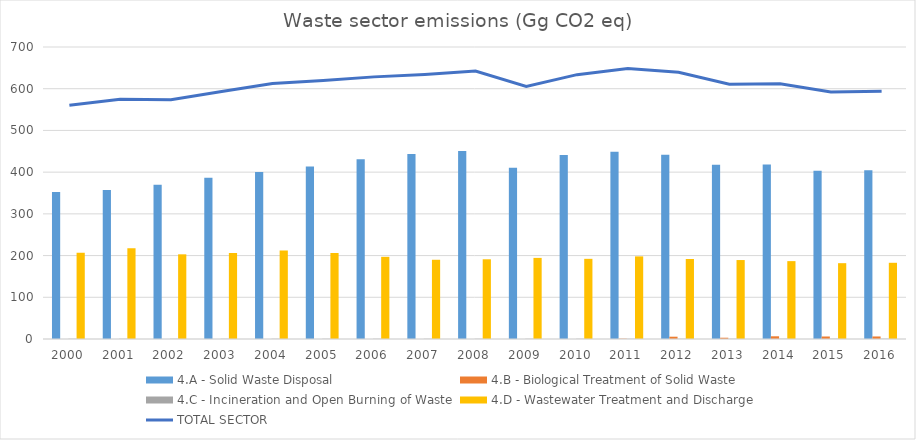
| Category | 4.A - Solid Waste Disposal | 4.B - Biological Treatment of Solid Waste | 4.C - Incineration and Open Burning of Waste | 4.D - Wastewater Treatment and Discharge |
|---|---|---|---|---|
| 2000.0 | 352.645 | 0 | 0.564 | 207.039 |
| 2001.0 | 356.954 | 0 | 0.552 | 217.299 |
| 2002.0 | 370.035 | 0 | 0.559 | 202.982 |
| 2003.0 | 386.472 | 0 | 0.519 | 206.25 |
| 2004.0 | 400.096 | 0 | 0.523 | 212.048 |
| 2005.0 | 413.28 | 0 | 0.523 | 205.895 |
| 2006.0 | 430.848 | 0 | 0.548 | 196.99 |
| 2007.0 | 443.772 | 0 | 0.529 | 189.938 |
| 2008.0 | 450.692 | 0 | 0.538 | 191.095 |
| 2009.0 | 410.477 | 0 | 0.518 | 194.44 |
| 2010.0 | 440.994 | 0 | 0.527 | 192.194 |
| 2011.0 | 449.123 | 0.816 | 0.568 | 198.031 |
| 2012.0 | 441.589 | 5.51 | 0.568 | 191.775 |
| 2013.0 | 417.598 | 3.05 | 0.588 | 189.28 |
| 2014.0 | 418.274 | 6.499 | 0.663 | 186.689 |
| 2015.0 | 403.605 | 6.016 | 0.739 | 181.765 |
| 2016.0 | 404.375 | 6.068 | 0.74 | 182.698 |